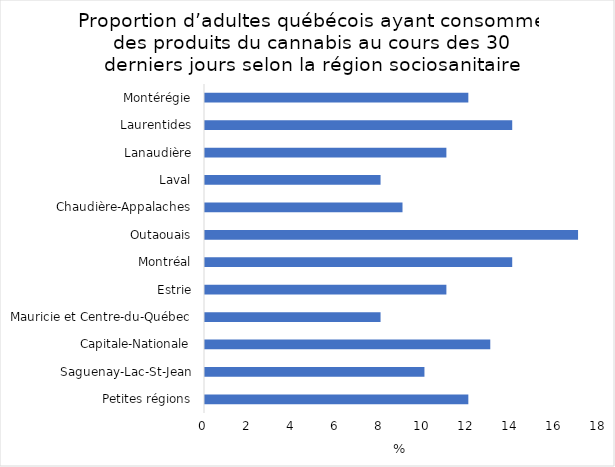
| Category | Series 0 |
|---|---|
| Petites régions | 12 |
| Saguenay-Lac-St-Jean | 10 |
| Capitale-Nationale | 13 |
| Mauricie et Centre-du-Québec | 8 |
| Estrie | 11 |
| Montréal | 14 |
| Outaouais | 17 |
| Chaudière-Appalaches | 9 |
| Laval | 8 |
| Lanaudière | 11 |
| Laurentides | 14 |
| Montérégie | 12 |